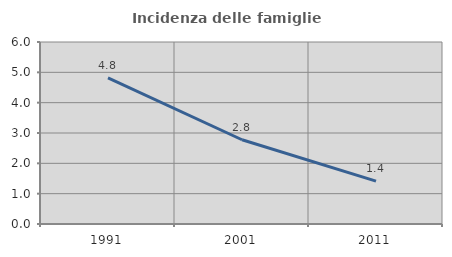
| Category | Incidenza delle famiglie numerose |
|---|---|
| 1991.0 | 4.818 |
| 2001.0 | 2.778 |
| 2011.0 | 1.414 |